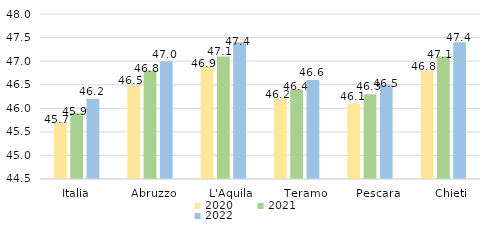
| Category | 2020 | 2021 | 2022 |
|---|---|---|---|
| Italia | 45.7 | 45.9 | 46.2 |
|   Abruzzo | 46.5 | 46.8 | 47 |
|     L'Aquila | 46.9 | 47.1 | 47.4 |
|     Teramo | 46.2 | 46.4 | 46.6 |
|     Pescara | 46.1 | 46.3 | 46.5 |
|     Chieti | 46.8 | 47.1 | 47.4 |